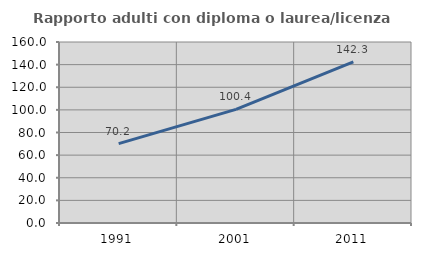
| Category | Rapporto adulti con diploma o laurea/licenza media  |
|---|---|
| 1991.0 | 70.17 |
| 2001.0 | 100.403 |
| 2011.0 | 142.335 |